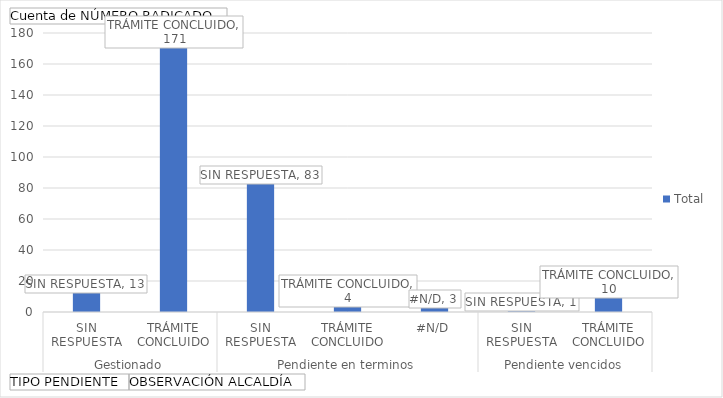
| Category | Total |
|---|---|
| 0 | 13 |
| 1 | 171 |
| 2 | 83 |
| 3 | 4 |
| 4 | 3 |
| 5 | 1 |
| 6 | 10 |